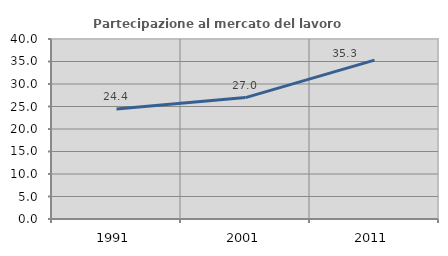
| Category | Partecipazione al mercato del lavoro  femminile |
|---|---|
| 1991.0 | 24.424 |
| 2001.0 | 26.977 |
| 2011.0 | 35.294 |